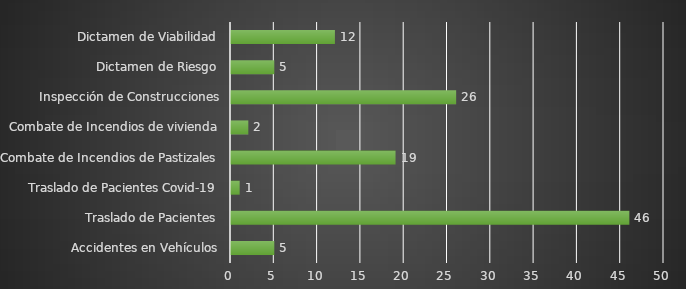
| Category | INDICADOR  |
|---|---|
| Accidentes en Vehículos | 5 |
| Traslado de Pacientes | 46 |
| Traslado de Pacientes Covid-19 | 1 |
| Combate de Incendios de Pastizales | 19 |
| Combate de Incendios de vivienda | 2 |
| Inspección de Construcciones | 26 |
| Dictamen de Riesgo | 5 |
| Dictamen de Viabilidad | 12 |